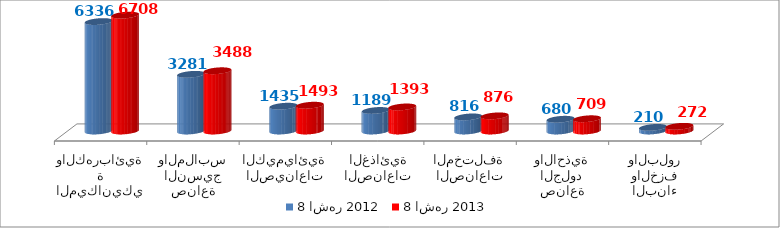
| Category | 8 اشهر 2012 | 8 اشهر 2013 |
|---|---|---|
| الصناعات الميكانيكية والكهربائية | 6336.01 | 6707.5 |
| صناعة النسيج والملابس | 3281 | 3487.7 |
| الصيناعات الكيميائية | 1435.173 | 1492.69 |
| الصناعات الغذائية | 1188.913 | 1392.521 |
| الصناعات المختلفة | 815.707 | 875.935 |
| صناعة الجلود والاحذية | 679.6 | 709.2 |
| صناعات مواد البناء والخزف والبلور | 209.825 | 271.72 |